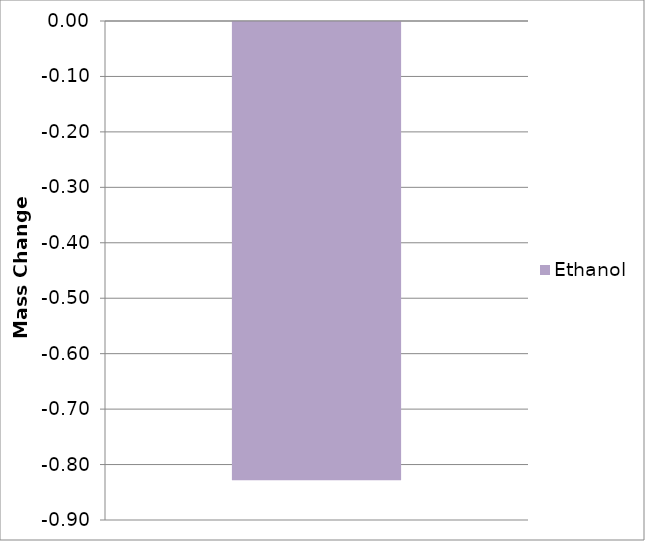
| Category | Ethanol |
|---|---|
| 0 | -0.827 |